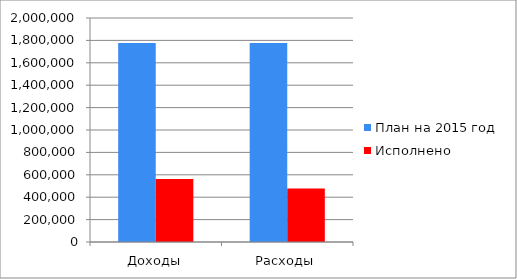
| Category | План на 2015 год | Исполнено  |
|---|---|---|
| Доходы | 1775806 | 561602 |
| Расходы | 1777308 | 476861 |